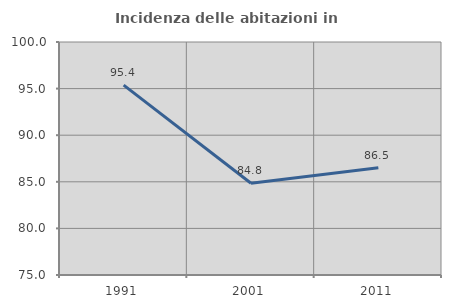
| Category | Incidenza delle abitazioni in proprietà  |
|---|---|
| 1991.0 | 95.373 |
| 2001.0 | 84.848 |
| 2011.0 | 86.496 |